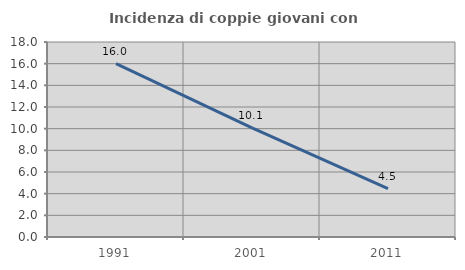
| Category | Incidenza di coppie giovani con figli |
|---|---|
| 1991.0 | 16 |
| 2001.0 | 10.078 |
| 2011.0 | 4.464 |